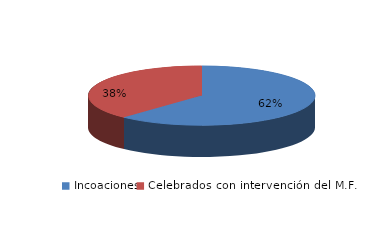
| Category | Series 0 |
|---|---|
| Incoaciones | 1081 |
| Celebrados con intervención del M.F. | 664 |